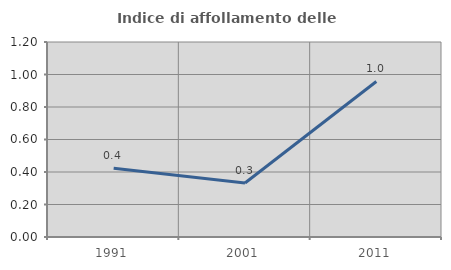
| Category | Indice di affollamento delle abitazioni  |
|---|---|
| 1991.0 | 0.423 |
| 2001.0 | 0.332 |
| 2011.0 | 0.957 |